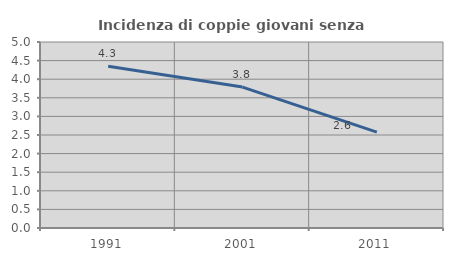
| Category | Incidenza di coppie giovani senza figli |
|---|---|
| 1991.0 | 4.348 |
| 2001.0 | 3.788 |
| 2011.0 | 2.578 |